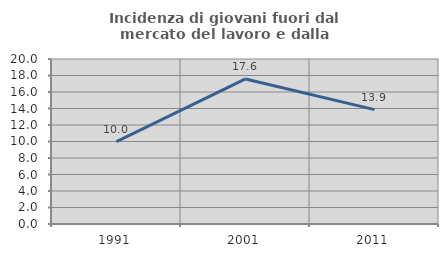
| Category | Incidenza di giovani fuori dal mercato del lavoro e dalla formazione  |
|---|---|
| 1991.0 | 9.981 |
| 2001.0 | 17.585 |
| 2011.0 | 13.866 |